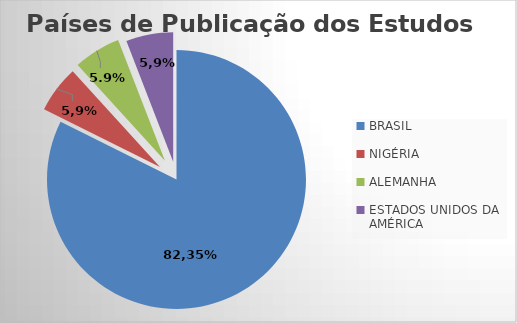
| Category | Series 0 |
|---|---|
| BRASIL | 14 |
| NIGÉRIA | 1 |
| ALEMANHA | 1 |
| ESTADOS UNIDOS DA AMÉRICA | 1 |